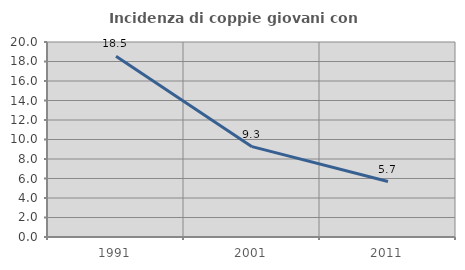
| Category | Incidenza di coppie giovani con figli |
|---|---|
| 1991.0 | 18.543 |
| 2001.0 | 9.265 |
| 2011.0 | 5.686 |